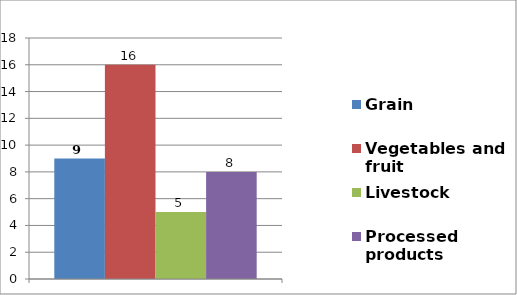
| Category | Grain | Vegetables and fruit | Livestock | Processed products |
|---|---|---|---|---|
|  | 9 | 16 | 5 | 8 |